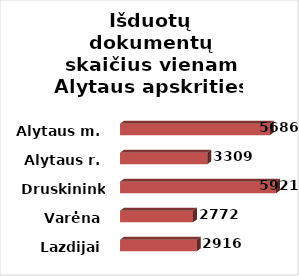
| Category | Series 0 |
|---|---|
| Lazdijai | 2916 |
| Varėna | 2772 |
| Druskininkai | 5921 |
| Alytaus r. | 3309 |
| Alytaus m. | 5686 |